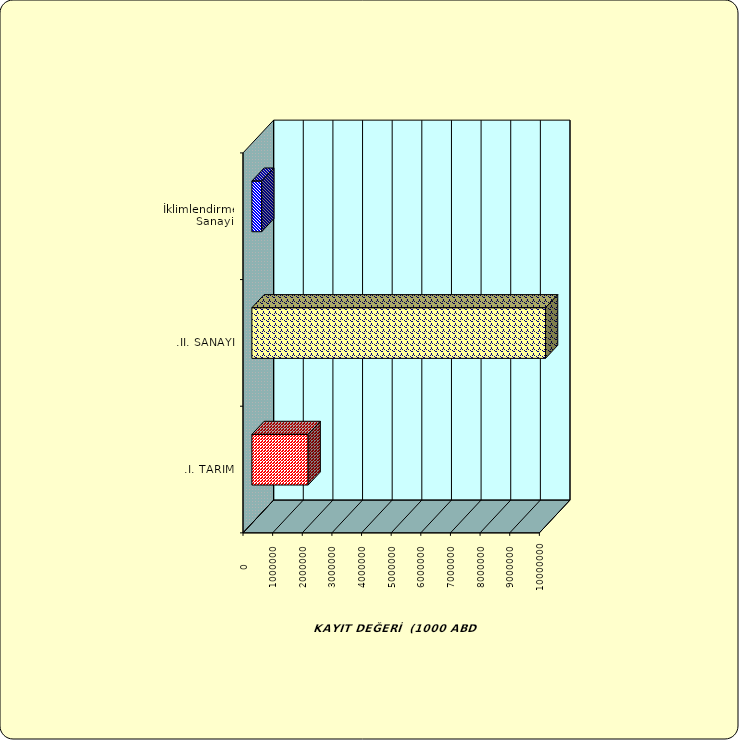
| Category | Series 0 |
|---|---|
| .I. TARIM | 1898128.867 |
| .II. SANAYİ | 9908370.538 |
|  İklimlendirme Sanayii | 331808.356 |